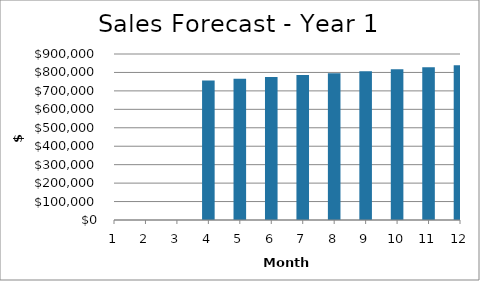
| Category | Year 1 |
|---|---|
| 1.0 | 0 |
| 2.0 | 0 |
| 3.0 | 0 |
| 4.0 | 756420.078 |
| 5.0 | 766044.395 |
| 6.0 | 775849.204 |
| 7.0 | 785840.588 |
| 8.0 | 796024.935 |
| 9.0 | 806408.955 |
| 10.0 | 816999.699 |
| 11.0 | 827804.579 |
| 12.0 | 838831.388 |